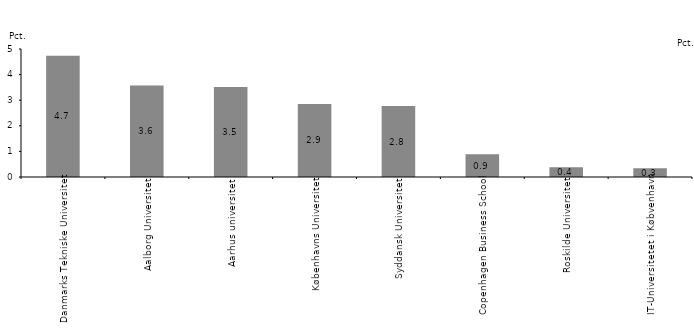
| Category | Series 0 |
|---|---|
| Danmarks Tekniske Universitet | 4.734 |
| Aalborg Universitet | 3.57 |
| Aarhus universitet | 3.517 |
| Københavns Universitet | 2.855 |
| Syddansk Universitet | 2.773 |
| Copenhagen Business School | 0.892 |
| Roskilde Universitet | 0.381 |
| IT-Universitetet i Købvenhavn | 0.339 |